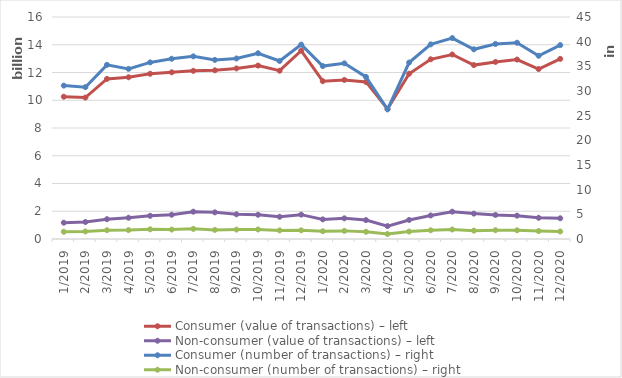
| Category | Consumer (value of transactions) – left | Non-consumer (value of transactions) – left |
|---|---|---|
| 1/2019 | 10256028672 | 1174704994 |
| 2/2019 | 10190906605 | 1223494692 |
| 3/2019 | 11537806714 | 1428615217 |
| 4/2019 | 11657498925 | 1532930956 |
| 5/2019 | 11908641119 | 1671723781 |
| 6/2019 | 12013485424 | 1747877657 |
| 7/2019 | 12119731561 | 1968537853 |
| 8/2019 | 12157346137 | 1921262771 |
| 9/2019 | 12292388883 | 1780038640 |
| 10/2019 | 12499657289 | 1747561950 |
| 11/2019 | 12128664384 | 1603354211 |
| 12/2019 | 13570132569 | 1755382788 |
| 1/2020 | 11373466823 | 1414501993 |
| 2/2020 | 11464550419 | 1488195455 |
| 3/2020 | 11320583462 | 1363318862 |
| 4/2020 | 9374741426 | 930666098 |
| 5/2020 | 11913191355 | 1374032060 |
| 6/2020 | 12951188026 | 1693976470 |
| 7/2020 | 13298280791 | 1969696659 |
| 8/2020 | 12532763419 | 1829633942 |
| 9/2020 | 12760800487 | 1733859007 |
| 10/2020 | 12932735553 | 1681324146 |
| 11/2020 | 12248052643 | 1528957073 |
| 12/2020 | 12981635622 | 1493777925 |